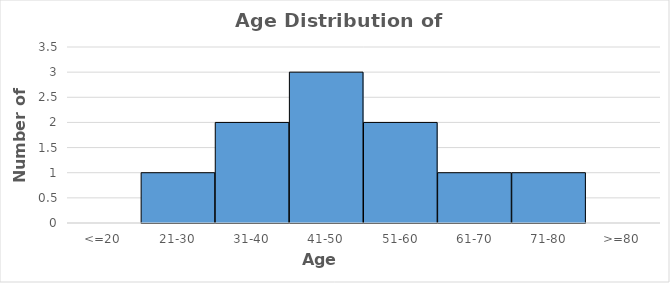
| Category | Series 0 |
|---|---|
| <=20 | 0 |
| 21-30 | 1 |
| 31-40 | 2 |
| 41-50 | 3 |
| 51-60 | 2 |
| 61-70 | 1 |
| 71-80 | 1 |
| >=80 | 0 |